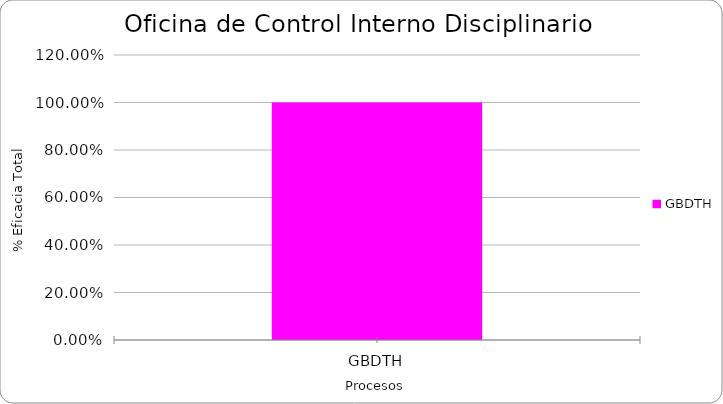
| Category | % Eficacia total |
|---|---|
| GBDTH | 1 |